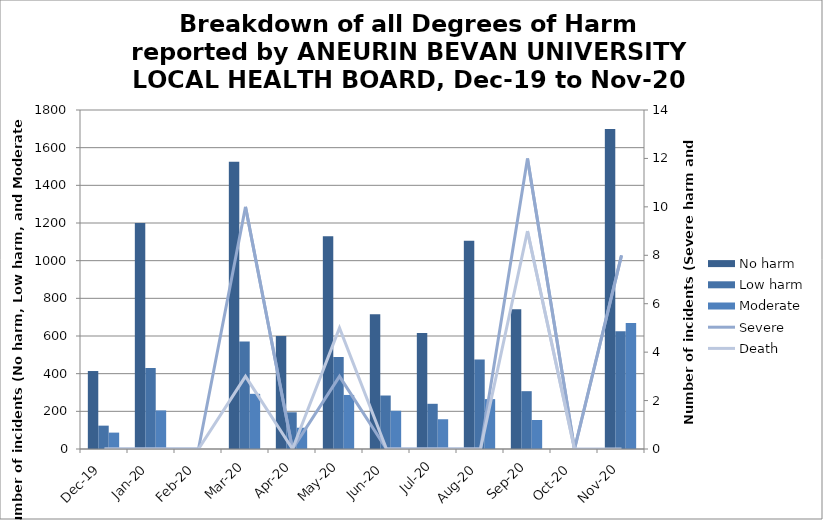
| Category | No harm | Low harm | Moderate |
|---|---|---|---|
| Dec-19 | 414 | 124 | 87 |
| Jan-20 | 1200 | 430 | 205 |
| Feb-20 | 0 | 0 | 0 |
| Mar-20 | 1525 | 571 | 293 |
| Apr-20 | 600 | 195 | 113 |
| May-20 | 1129 | 489 | 287 |
| Jun-20 | 715 | 284 | 203 |
| Jul-20 | 616 | 240 | 158 |
| Aug-20 | 1106 | 475 | 265 |
| Sep-20 | 742 | 307 | 154 |
| Oct-20 | 0 | 0 | 0 |
| Nov-20 | 1699 | 625 | 669 |